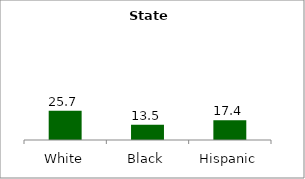
| Category | Series 0 |
|---|---|
| White | 25.697 |
| Black | 13.456 |
| Hispanic | 17.405 |